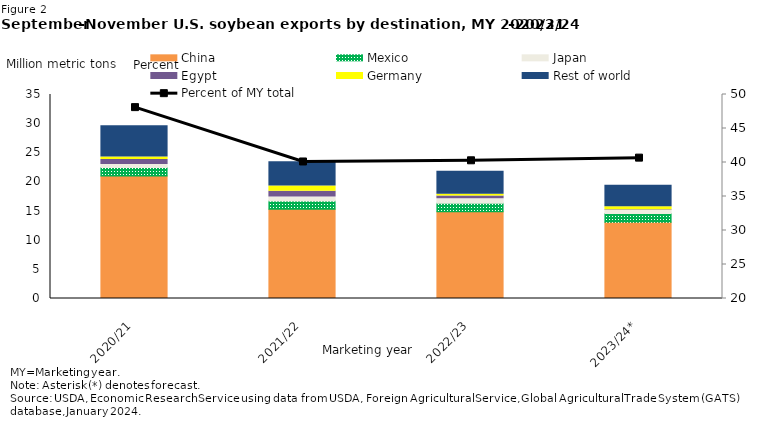
| Category |  China  | Mexico | Japan | Egypt | Germany | Rest of world |
|---|---|---|---|---|---|---|
| 2020/21 | 21.018 | 1.441 | 0.523 | 0.865 | 0.445 | 5.35 |
| 2021/22 | 15.295 | 1.433 | 0.695 | 0.981 | 0.897 | 4.171 |
| 2022/23 | 14.896 | 1.442 | 0.788 | 0.442 | 0.302 | 3.95 |
| 2023/24* | 13.066 | 1.502 | 0.573 | 0.095 | 0.497 | 3.68 |